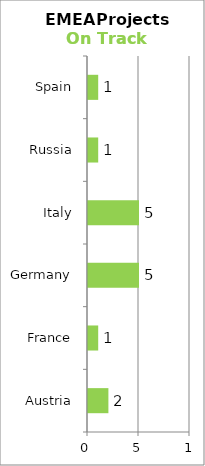
| Category | Total |
|---|---|
| Austria | 2 |
| France | 1 |
| Germany | 5 |
| Italy | 5 |
| Russia | 1 |
| Spain | 1 |